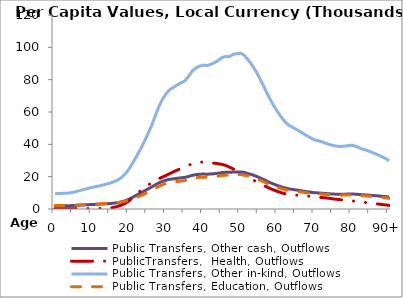
| Category | Public Transfers, Other cash, Outflows | PublicTransfers,  Health, Outflows | Public Transfers, Other in-kind, Outflows | Public Transfers, Education, Outflows |
|---|---|---|---|---|
| 0 | 1965.214 | 204.617 | 9453.539 | 2095.237 |
|  | 2002.481 | 208.497 | 9632.81 | 2134.97 |
| 2 | 2008.617 | 209.136 | 9662.326 | 2141.511 |
| 3 | 2021.058 | 210.431 | 9722.173 | 2154.775 |
| 4 | 2074.468 | 215.992 | 9979.098 | 2211.719 |
| 5 | 2155.258 | 224.404 | 10367.732 | 2297.854 |
| 6 | 2272.582 | 236.62 | 10932.111 | 2422.94 |
| 7 | 2406.577 | 250.571 | 11576.689 | 2565.802 |
| 8 | 2538.392 | 264.296 | 12210.775 | 2706.337 |
| 9 | 2657.867 | 276.735 | 12785.5 | 2833.717 |
| 10 | 2775.607 | 288.994 | 13351.885 | 2959.247 |
| 11 | 2883.525 | 300.603 | 13871.017 | 3074.305 |
| 12 | 2975.658 | 318.566 | 14313.077 | 3172.282 |
| 13 | 3088.523 | 352.911 | 14842.354 | 3289.588 |
| 14 | 3225.837 | 465.536 | 15435.263 | 3420.997 |
| 15 | 3398.804 | 688.049 | 16116.999 | 3572.094 |
| 16 | 3646.003 | 1083.111 | 17001.812 | 3768.2 |
| 17 | 3960.091 | 1699.359 | 17988.108 | 3986.798 |
| 18 | 4442.334 | 2485.667 | 19574.431 | 4338.382 |
| 19 | 5145.424 | 3590.464 | 21840.471 | 4840.617 |
| 20 | 6105.713 | 5134.682 | 24823.807 | 5501.829 |
| 21 | 7302.603 | 7077.552 | 28606.937 | 6340.304 |
| 22 | 8582.523 | 9120.479 | 32707.361 | 7249.102 |
| 23 | 9822.834 | 11108.679 | 36805.947 | 8157.493 |
| 24 | 11063.953 | 13023.015 | 41279.294 | 9148.944 |
| 25 | 12315.708 | 14711.806 | 46202.78 | 10240.162 |
| 26 | 13527.509 | 16111.047 | 51355.442 | 11382.173 |
| 27 | 14863.868 | 17449.274 | 57440.666 | 12730.872 |
| 28 | 16150.595 | 18733.957 | 63376.473 | 14046.456 |
| 29 | 17134.632 | 19804.281 | 67984.137 | 15067.676 |
| 30 | 17864.427 | 20816.295 | 71496.562 | 15846.153 |
| 31 | 18387.071 | 21962.466 | 73963.641 | 16392.945 |
| 32 | 18685.766 | 23072.5 | 75336.449 | 16697.207 |
| 33 | 19016.035 | 24105.426 | 76849.854 | 17032.631 |
| 34 | 19288.94 | 25258.378 | 78099.54 | 17309.606 |
| 35 | 19542.769 | 26280.479 | 79280.425 | 17571.331 |
| 36 | 20116.348 | 27120.978 | 82033.192 | 18181.441 |
| 37 | 20822.298 | 27873.271 | 85400.055 | 18927.657 |
| 38 | 21241.58 | 28512.792 | 87218.531 | 19330.695 |
| 39 | 21525.472 | 28912.707 | 88423.536 | 19597.766 |
| 40 | 21612.326 | 29096.208 | 88945.704 | 19713.497 |
| 41 | 21529.725 | 28969.682 | 88781.337 | 19677.068 |
| 42 | 21635.43 | 28613.645 | 89481.048 | 19832.148 |
| 43 | 21858.024 | 28294.394 | 90551.047 | 20069.298 |
| 44 | 22156.598 | 27994.057 | 91874.062 | 20362.524 |
| 45 | 22556.748 | 27588.895 | 93722.198 | 20772.136 |
| 46 | 22695.547 | 26948.736 | 94376.969 | 20917.257 |
| 47 | 22657.372 | 25951.783 | 94323.751 | 20905.462 |
| 48 | 22899.484 | 24841.196 | 95674.752 | 21204.891 |
| 49 | 22926.605 | 23503.543 | 96072.088 | 21292.955 |
| 50 | 22927.42 | 22185.492 | 96326.043 | 21349.24 |
| 51 | 22627.715 | 20905.838 | 95160.562 | 21090.928 |
| 52 | 21960.159 | 19584.533 | 92266.318 | 20449.462 |
| 53 | 21282.405 | 18393.916 | 89360.412 | 19805.411 |
| 54 | 20455.642 | 17214.26 | 85777.868 | 19011.393 |
| 55 | 19498.064 | 16012.936 | 81630.498 | 18092.19 |
| 56 | 18437.402 | 14833.41 | 76998.137 | 17065.496 |
| 57 | 17347.364 | 13700.864 | 72275.841 | 16018.869 |
| 58 | 16273.894 | 12643.351 | 67660.467 | 14995.94 |
| 59 | 15319.38 | 11668.486 | 63598.338 | 14095.629 |
| 60 | 14480.626 | 10800.167 | 60034.216 | 13305.694 |
| 61 | 13689.639 | 10034.802 | 56694.51 | 12565.498 |
| 62 | 12992.177 | 9416.929 | 53810.233 | 11926.241 |
| 63 | 12477 | 9016.455 | 51806.509 | 11482.145 |
| 64 | 12111.901 | 8782.248 | 50511.897 | 11195.213 |
| 65 | 11768.061 | 8606.877 | 49297.841 | 10926.136 |
| 66 | 11399.974 | 8415.467 | 47940.879 | 10625.385 |
| 67 | 11022.633 | 8237.533 | 46510.875 | 10308.446 |
| 68 | 10660.548 | 8046.213 | 45091.804 | 9993.93 |
| 69 | 10341.546 | 7815.391 | 43819.187 | 9711.873 |
| 70 | 10067.362 | 7539.252 | 42676.988 | 9458.722 |
| 71 | 9927.878 | 7279.992 | 42159.113 | 9343.943 |
| 72 | 9762.245 | 7068.714 | 41499.067 | 9197.653 |
| 73 | 9549.269 | 6851.668 | 40586.93 | 8995.491 |
| 74 | 9381.786 | 6580.467 | 39875.121 | 8837.73 |
| 75 | 9237.292 | 6263.133 | 39240.246 | 8697.019 |
| 76 | 9140.057 | 5977.329 | 38787.374 | 8596.647 |
| 77 | 9110.339 | 5712.774 | 38650.126 | 8566.228 |
| 78 | 9164.878 | 5470.389 | 38891.909 | 8619.815 |
| 79 | 9235.816 | 5234.574 | 39199.326 | 8687.95 |
| 80 | 9307.705 | 5018.961 | 39501.977 | 8755.028 |
| 81 | 9160.816 | 4762.037 | 38768.288 | 8592.417 |
| 82 | 8962.287 | 4469.685 | 37790.086 | 8375.612 |
| 83 | 8797.554 | 4184.683 | 36969.887 | 8193.828 |
| 84 | 8665.33 | 3926.911 | 36299.407 | 8045.226 |
| 85 | 8487.194 | 3648.097 | 35406.976 | 7847.431 |
| 86 | 8302.21 | 3372.964 | 34479.872 | 7641.953 |
| 87 | 8103.532 | 3097.263 | 33486.809 | 7421.855 |
| 88 | 7886.632 | 2816.948 | 32407.34 | 7182.607 |
| 89 | 7649.791 | 2529.784 | 31233.616 | 6922.468 |
| 90+ | 7357.412 | 2227.102 | 29793.966 | 6603.391 |